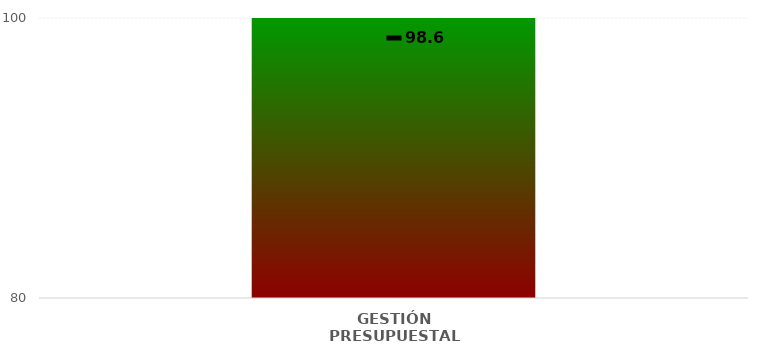
| Category | Niveles |
|---|---|
| GESTIÓN PRESUPUESTAL | 100 |